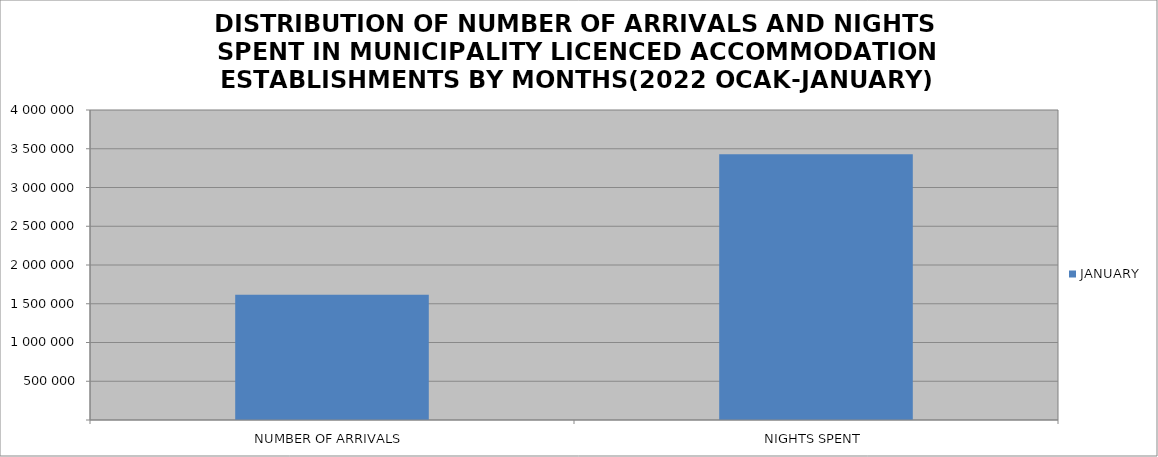
| Category | JANUARY |
|---|---|
| NUMBER OF ARRIVALS | 1617436 |
| NIGHTS SPENT | 3427709 |